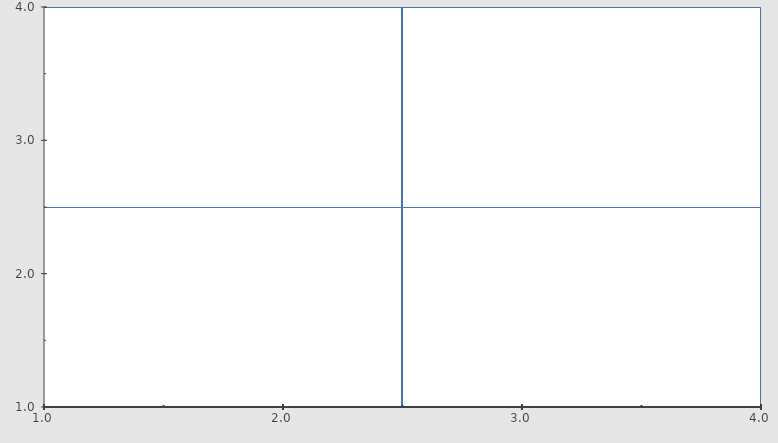
| Category | Accessibility |
|---|---|
| 0.0 | 0 |
| 0.0 | 0 |
| 0.0 | 0 |
| 0.0 | 0 |
| 0.0 | 0 |
| 0.0 | 0 |
| 0.0 | 0 |